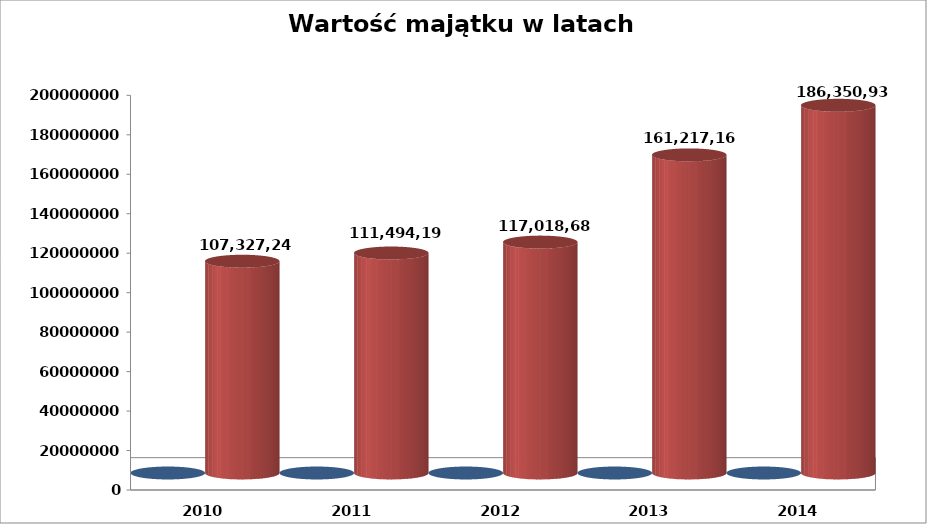
| Category | Rok | Wartość majątku |
|---|---|---|
| 2010.0 | 2010 | 107327241 |
| 2011.0 | 2011 | 111494190 |
| 2012.0 | 2012 | 117018689 |
| 2013.0 | 2013 | 161217165 |
| 2014.0 | 2014 | 186350937.44 |